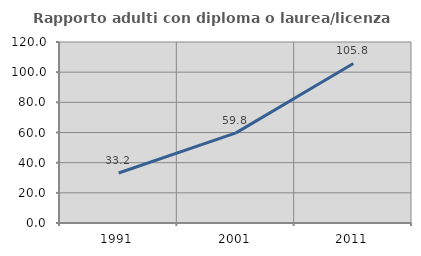
| Category | Rapporto adulti con diploma o laurea/licenza media  |
|---|---|
| 1991.0 | 33.168 |
| 2001.0 | 59.758 |
| 2011.0 | 105.782 |